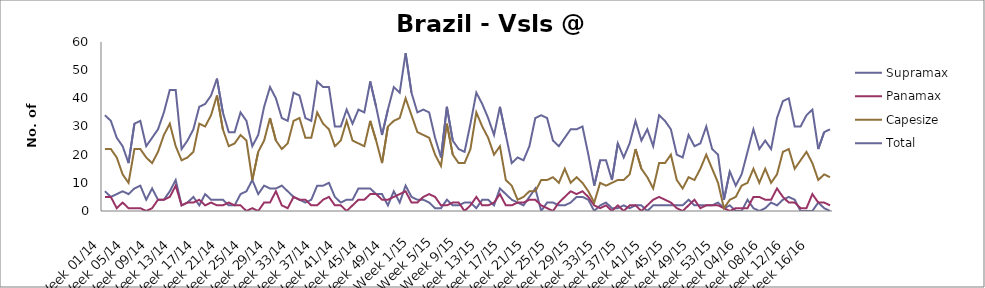
| Category | Supramax | Panamax | Capesize | Total |
|---|---|---|---|---|
| Week 01/14 | 7 | 5 | 22 | 34 |
| Week 02/14 | 5 | 5 | 22 | 32 |
| Week 03/14 | 6 | 1 | 19 | 26 |
| Week 04/14 | 7 | 3 | 13 | 23 |
| Week 05/14 | 6 | 1 | 10 | 17 |
| Week 06/14 | 8 | 1 | 22 | 31 |
| Week 07/14 | 9 | 1 | 22 | 32 |
| Week 08/14 | 4 | 0 | 19 | 23 |
| Week 09/14 | 8 | 1 | 17 | 26 |
| Week 10/14 | 4 | 4 | 21 | 29 |
| Week 11/14 | 4 | 4 | 27 | 35 |
| Week 12/14 | 7 | 5 | 31 | 43 |
| Week 13/14 | 11 | 9 | 23 | 43 |
| Week 14/14 | 2 | 2 | 18 | 22 |
| Week 15/14 | 3 | 3 | 19 | 25 |
| Week 16/14 | 5 | 3 | 21 | 29 |
| Week 17/14 | 2 | 4 | 31 | 37 |
| Week 18/14 | 6 | 2 | 30 | 38 |
| Week 19/14 | 4 | 3 | 34 | 41 |
| Week 20/14 | 4 | 2 | 41 | 47 |
| Week 21/14 | 4 | 2 | 29 | 35 |
| Week 22/14 | 2 | 3 | 23 | 28 |
| Week 23/14 | 2 | 2 | 24 | 28 |
| Week 24/14 | 6 | 2 | 27 | 35 |
| Week 25/14 | 7 | 0 | 25 | 32 |
| Week 26/14 | 11 | 1 | 11 | 23 |
| Week 27/14 | 6 | 0 | 21 | 27 |
| Week 28/14 | 9 | 3 | 25 | 37 |
| Week 29/14 | 8 | 3 | 33 | 44 |
| Week 30/14 | 8 | 7 | 25 | 40 |
| Week 31/14 | 9 | 2 | 22 | 33 |
| Week 32/14 | 7 | 1 | 24 | 32 |
| Week 33/14 | 5 | 5 | 32 | 42 |
| Week 34/14 | 4 | 4 | 33 | 41 |
| Week 35/14 | 3 | 4 | 26 | 33 |
| Week 36/14 | 4 | 2 | 26 | 32 |
| Week 37/14 | 9 | 2 | 35 | 46 |
| Week 38/14 | 9 | 4 | 31 | 44 |
| Week 39/14 | 10 | 5 | 29 | 44 |
| Week 40/14 | 5 | 2 | 23 | 30 |
| Week 41/14 | 3 | 2 | 25 | 30 |
| Week 42/14 | 4 | 0 | 32 | 36 |
| Week 43/14 | 4 | 2 | 25 | 31 |
| Week 44/14 | 8 | 4 | 24 | 36 |
| Week 45/14 | 8 | 4 | 23 | 35 |
| Week 46/14 | 8 | 6 | 32 | 46 |
| Week 47/14 | 6 | 6 | 25 | 37 |
| Week 48/14 | 6 | 4 | 17 | 27 |
| Week 49/14 | 2 | 4 | 30 | 36 |
| Week 50/14 | 7 | 5 | 32 | 44 |
| Week 51/14 | 3 | 6 | 33 | 42 |
| Week 52/14 | 9 | 7 | 40 | 56 |
| Week 1/15 | 5 | 3 | 34 | 42 |
| Week 2/15 | 4 | 3 | 28 | 35 |
| Week 3/15 | 4 | 5 | 27 | 36 |
| Week 4/15 | 3 | 6 | 26 | 35 |
| Week 5/15 | 1 | 5 | 20 | 26 |
| Week 6/15 | 1 | 2 | 16 | 19 |
| Week 7/15 | 4 | 2 | 31 | 37 |
| Week 8/15 | 2 | 3 | 20 | 25 |
| Week 9/15 | 2 | 3 | 17 | 22 |
| Week 10/15 | 3 | 0 | 17 | 21 |
| Week 11/15 | 3 | 2 | 22 | 31 |
| Week 12/15 | 1 | 5 | 35 | 42 |
| Week 13/15 | 4 | 2 | 30 | 38 |
| Week 14/15 | 4 | 2 | 26 | 33 |
| Week 15/15 | 2 | 3 | 20 | 27 |
| Week 16/15 | 8 | 6 | 23 | 37 |
| Week 17/15 | 6 | 2 | 11 | 27 |
| Week 18/15 | 4 | 2 | 9 | 17 |
| Week 19/15 | 3 | 3 | 4 | 19 |
| Week 20/15 | 2 | 3 | 5 | 18 |
| Week 21/15 | 5 | 4 | 7 | 23 |
| Week 22/15 | 8 | 4 | 7 | 33 |
| Week 23/15 | 0 | 2 | 11 | 34 |
| Week 24/15 | 3 | 1 | 11 | 33 |
| Week 25/15 | 3 | 0 | 12 | 25 |
| Week 26/15 | 2 | 3 | 10 | 23 |
| Week 27/15 | 2 | 5 | 15 | 26 |
| Week 28/15 | 3 | 7 | 10 | 29 |
| Week 29/15 | 5 | 6 | 12 | 29 |
| Week 30/15 | 5 | 7 | 10 | 30 |
| Week 31/15 | 4 | 5 | 7 | 20 |
| Week 32/15 | 0 | 2 | 3 | 9 |
| Week 33/15 | 2 | 1 | 10 | 18 |
| Week 34/15 | 3 | 2 | 9 | 18 |
| Week 35/15 | 1 | 0 | 10 | 11 |
| Week 36/15 | 1 | 2 | 11 | 24 |
| Week 37/15 | 2 | 0 | 11 | 19 |
| Week 38/15 | 1 | 2 | 13 | 24 |
| Week 39/15 | 2 | 2 | 22 | 32 |
| Week 40/15 | 2 | 0 | 15 | 25 |
| Week 41/15 | 0 | 2 | 12 | 29 |
| Week 42/15 | 2 | 4 | 8 | 23 |
| Week 43/15 | 2 | 5 | 17 | 34 |
| Week 44/15 | 2 | 4 | 17 | 32 |
| Week 45/15 | 2 | 3 | 20 | 29 |
| Week 46/15 | 2 | 1 | 11 | 20 |
| Week 47/15 | 2 | 0 | 8 | 19 |
| Week 48/15 | 4 | 2 | 12 | 27 |
| Week 49/15 | 2 | 4 | 11 | 23 |
| Week 50/15 | 2 | 1 | 15 | 24 |
| Week 51/15 | 2 | 2 | 20 | 30 |
| Week 52/15 | 2 | 2 | 15 | 22 |
| Week 53/15 | 3 | 2 | 10 | 20 |
| Week 01/16 | 1 | 1 | 1 | 4 |
| Week 02/16 | 2 | 0 | 4 | 14 |
| Week 03/16 | 0 | 1 | 5 | 9 |
| Week 04/16 | 0 | 1 | 9 | 13 |
| Week 05/16 | 4 | 1 | 10 | 21 |
| Week 06/16 | 1 | 5 | 15 | 29 |
| Week 07/16 | 0 | 5 | 10 | 22 |
| Week 08/16 | 1 | 4 | 15 | 25 |
| Week 09/16 | 3 | 4 | 10 | 22 |
| Week 10/16 | 2 | 8 | 13 | 33 |
| Week 11/16 | 4 | 5 | 21 | 39 |
| Week 12/16 | 5 | 3 | 22 | 40 |
| Week 13/16 | 4 | 3 | 15 | 30 |
| Week 14/16 | 0 | 1 | 18 | 30 |
| Week 15/16 | 0 | 1 | 21 | 34 |
| Week 16/16 | 0 | 6 | 17 | 36 |
| Week 17/16 | 3 | 3 | 11 | 22 |
| Week 18/16 | 1 | 3 | 13 | 28 |
| Week 19/16 | 0 | 2 | 12 | 29 |